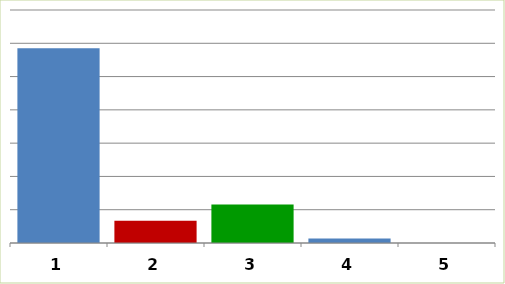
| Category | Series 0 |
|---|---|
| 0 | 292391206 |
| 1 | 33568630 |
| 2 | 57926350 |
| 3 | 6591983 |
| 4 | 0 |